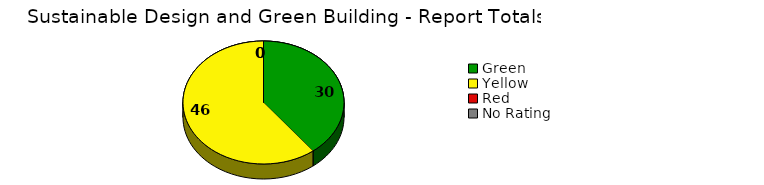
| Category | Series 0 |
|---|---|
| Green | 30 |
| Yellow | 46 |
| Red | 0 |
| No Rating | 0 |